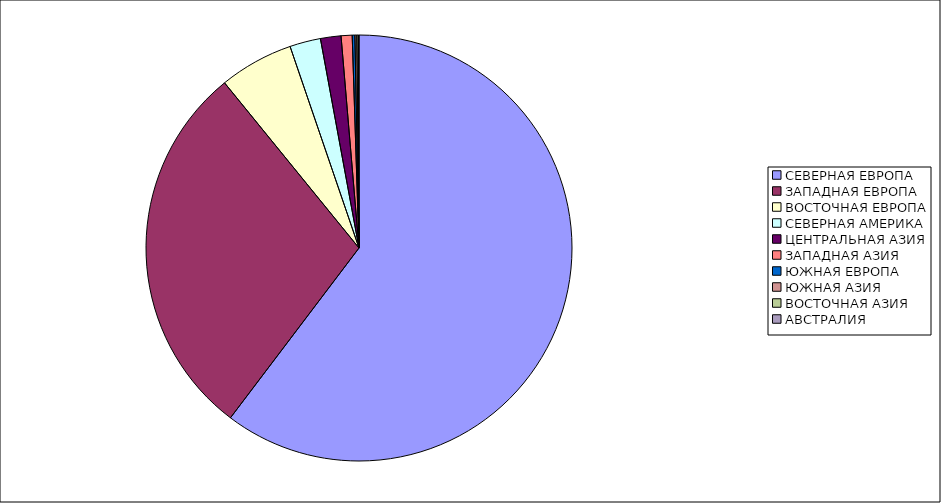
| Category | Оборот |
|---|---|
| СЕВЕРНАЯ ЕВРОПА | 60.313 |
| ЗАПАДНАЯ ЕВРОПА | 28.813 |
| ВОСТОЧНАЯ ЕВРОПА | 5.63 |
| СЕВЕРНАЯ АМЕРИКА | 2.342 |
| ЦЕНТРАЛЬНАЯ АЗИЯ | 1.556 |
| ЗАПАДНАЯ АЗИЯ | 0.836 |
| ЮЖНАЯ ЕВРОПА | 0.202 |
| ЮЖНАЯ АЗИЯ | 0.143 |
| ВОСТОЧНАЯ АЗИЯ | 0.115 |
| АВСТРАЛИЯ | 0.05 |